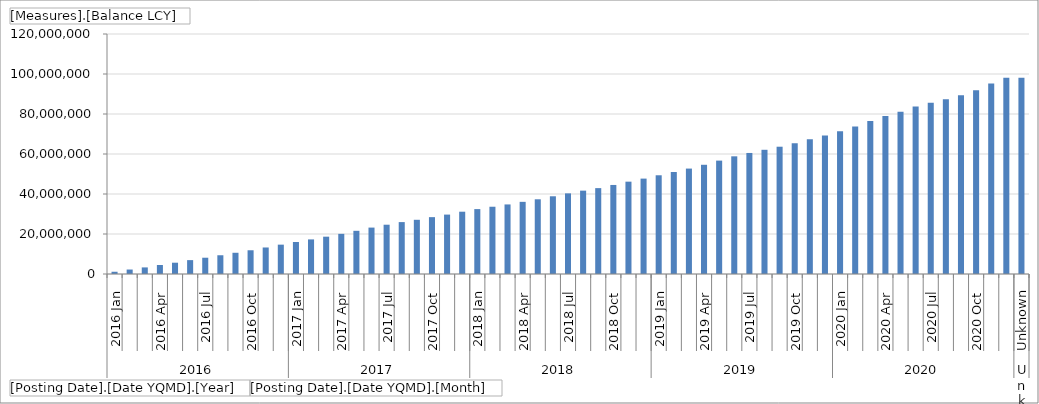
| Category | Total |
|---|---|
| 0 | 1123468.13 |
| 1 | 2235884.47 |
| 2 | 3294150.84 |
| 3 | 4490282.85 |
| 4 | 5648469.31 |
| 5 | 6938632.69 |
| 6 | 8140927.98 |
| 7 | 9374238.48 |
| 8 | 10613843.29 |
| 9 | 11867329.4 |
| 10 | 13258829.5 |
| 11 | 14675442.99 |
| 12 | 16003805.51 |
| 13 | 17298596.82 |
| 14 | 18663953.84 |
| 15 | 20075375.83 |
| 16 | 21593868.89 |
| 17 | 23206926.1 |
| 18 | 24646013.63 |
| 19 | 25952856.48 |
| 20 | 27104619.85 |
| 21 | 28431012.41 |
| 22 | 29705326.18 |
| 23 | 31148050.24 |
| 24 | 32454647.06 |
| 25 | 33632695.22 |
| 26 | 34783763.95 |
| 27 | 36077009.8 |
| 28 | 37356001.4 |
| 29 | 38858882.65 |
| 30 | 40318364.08 |
| 31 | 41677622.84 |
| 32 | 42940312.18 |
| 33 | 44520638.82 |
| 34 | 46169187.85 |
| 35 | 47699154.53 |
| 36 | 49363316.39 |
| 37 | 50991308.74 |
| 38 | 52709962.27 |
| 39 | 54609598.55 |
| 40 | 56693377.65 |
| 41 | 58839639.88 |
| 42 | 60521452.08 |
| 43 | 62105468.22 |
| 44 | 63643216.13 |
| 45 | 65373499.98 |
| 46 | 67316518.93 |
| 47 | 69289126.46 |
| 48 | 71359259.47 |
| 49 | 73803698.49 |
| 50 | 76542118.77 |
| 51 | 78985403.68 |
| 52 | 81156769.18 |
| 53 | 83743770.71 |
| 54 | 85632636.36 |
| 55 | 87409512.57 |
| 56 | 89434090.81 |
| 57 | 91856532.69 |
| 58 | 95268393.15 |
| 59 | 98163531.51 |
| 60 | 98163531.51 |